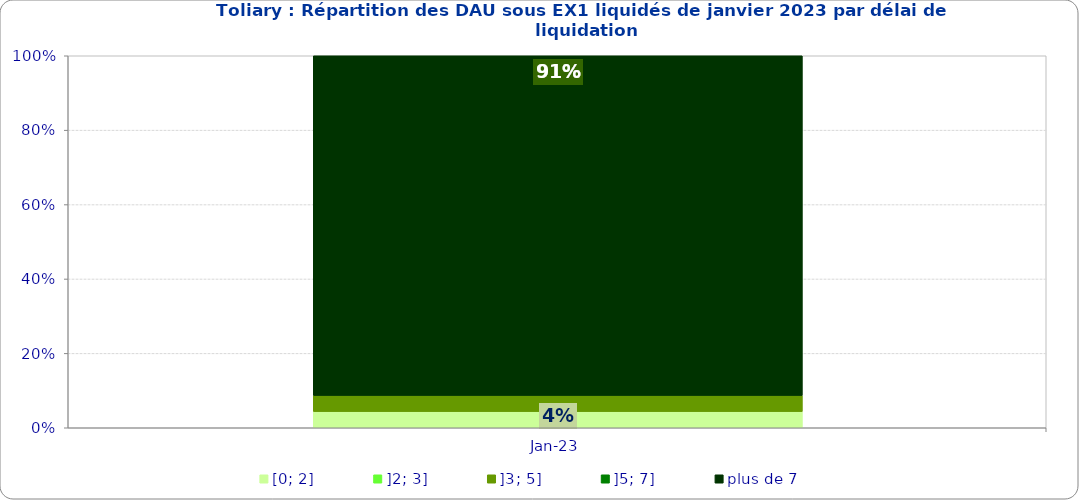
| Category | [0; 2] | ]2; 3] | ]3; 5] | ]5; 7] | plus de 7 |
|---|---|---|---|---|---|
| 2023-01-01 | 0.043 | 0 | 0.043 | 0 | 0.913 |